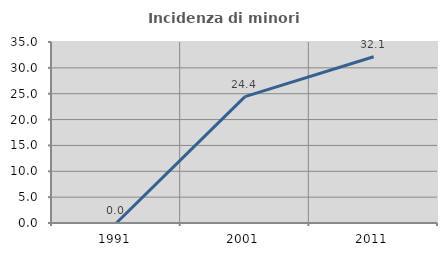
| Category | Incidenza di minori stranieri |
|---|---|
| 1991.0 | 0 |
| 2001.0 | 24.444 |
| 2011.0 | 32.143 |